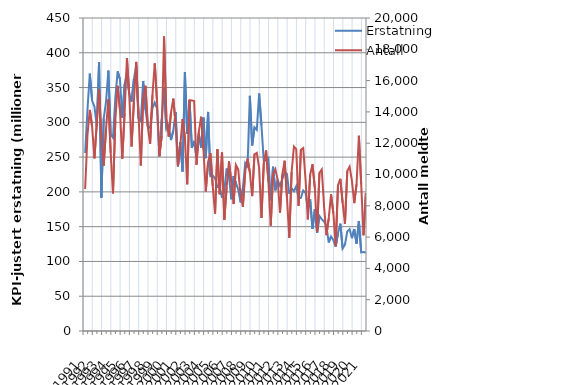
| Category | Erstatning |
|---|---|
| 1991.0 | 255.886 |
| nan | 318.368 |
| nan | 370.015 |
| nan | 331.4 |
| 1992.0 | 322.6 |
| nan | 294.766 |
| nan | 386.29 |
| nan | 191.585 |
| 1993.0 | 305.63 |
| nan | 329.304 |
| nan | 374.392 |
| nan | 282.696 |
| 1994.0 | 277.884 |
| nan | 334.599 |
| nan | 373.218 |
| nan | 362.084 |
| 1995.0 | 306.575 |
| nan | 354.65 |
| nan | 372.432 |
| nan | 341.038 |
| 1996.0 | 329.703 |
| nan | 361.938 |
| nan | 381.874 |
| nan | 305.3 |
| 1997.0 | 301.841 |
| nan | 359.509 |
| nan | 318.212 |
| nan | 294.175 |
| 1998.0 | 291.982 |
| nan | 320.299 |
| nan | 328.44 |
| nan | 319.603 |
| 1999.0 | 251.08 |
| nan | 304.66 |
| nan | 350.136 |
| nan | 290.408 |
| 2000.0 | 296.025 |
| nan | 274.529 |
| nan | 287.968 |
| nan | 314.82 |
| 2001.0 | 236.741 |
| nan | 271.533 |
| nan | 229.297 |
| nan | 371.9 |
| 2002.0 | 283.153 |
| nan | 331.963 |
| nan | 263.258 |
| nan | 273.322 |
| 2003.0 | 249.725 |
| nan | 282.969 |
| nan | 263.856 |
| nan | 306.798 |
| 2004.0 | 248.466 |
| nan | 314.976 |
| nan | 222.537 |
| nan | 223.466 |
| 2005.0 | 219.654 |
| nan | 207.02 |
| nan | 207.879 |
| nan | 191.437 |
| 2006.0 | 201.986 |
| nan | 233.583 |
| nan | 222.779 |
| nan | 189.37 |
| 2007.0 | 222.799 |
| nan | 212.832 |
| nan | 202.982 |
| nan | 184.866 |
| 2008.0 | 205.392 |
| nan | 241.499 |
| nan | 236.674 |
| nan | 338.103 |
| 2009.0 | 266.73 |
| nan | 292.74 |
| nan | 289.075 |
| nan | 341.428 |
| 2010.0 | 295.394 |
| nan | 244.587 |
| nan | 245.591 |
| nan | 248.519 |
| 2011.0 | 187.974 |
| nan | 236.129 |
| nan | 202.189 |
| nan | 217.026 |
| 2012.0 | 208.677 |
| nan | 218.734 |
| nan | 228.597 |
| nan | 225.594 |
| 2013.0 | 197.36 |
| nan | 205.137 |
| nan | 200.921 |
| nan | 208.167 |
| 2014.0 | 190.199 |
| nan | 191.416 |
| nan | 202.081 |
| nan | 198.936 |
| 2015.0 | 175.56 |
| nan | 189.155 |
| nan | 146.829 |
| nan | 174.991 |
| 2016.0 | 140.925 |
| nan | 165.396 |
| nan | 160.531 |
| nan | 157.627 |
| 2017.0 | 150.777 |
| nan | 127.258 |
| nan | 135.895 |
| nan | 130.672 |
| 2018.0 | 121.18 |
| nan | 140.64 |
| nan | 154.302 |
| nan | 118.645 |
| 2019.0 | 124.255 |
| nan | 143.17 |
| nan | 146.364 |
| nan | 133.443 |
| 2020.0 | 146.649 |
| nan | 125.513 |
| nan | 158.098 |
| nan | 113.015 |
| 2021.0 | 113.516 |
| nan | 112.697 |